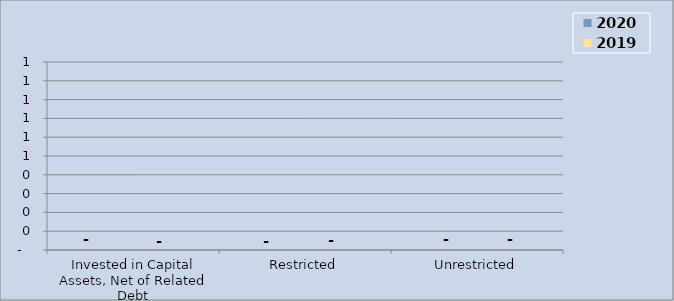
| Category | 2020 | 2019 |
|---|---|---|
| Invested in Capital Assets, Net of Related Debt | 0 |  |
| Restricted | 0 |  |
| Unrestricted | 0 |  |